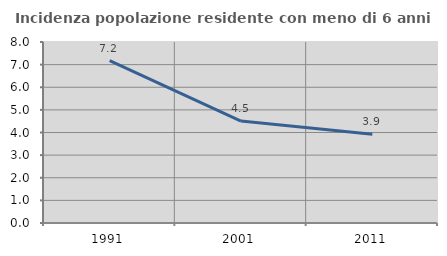
| Category | Incidenza popolazione residente con meno di 6 anni |
|---|---|
| 1991.0 | 7.177 |
| 2001.0 | 4.505 |
| 2011.0 | 3.924 |